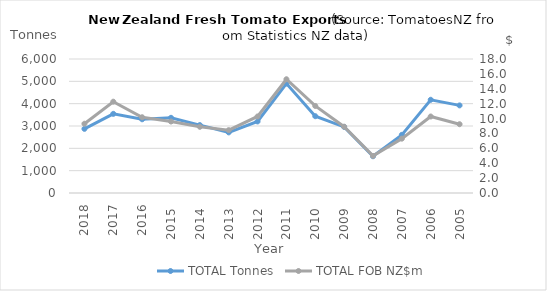
| Category | TOTAL Tonnes |
|---|---|
| 2018.0 | 2872.624 |
| 2017.0 | 3544.228 |
| 2016.0 | 3301.061 |
| 2015.0 | 3366.787 |
| 2014.0 | 3040.504 |
| 2013.0 | 2713.667 |
| 2012.0 | 3203.964 |
| 2011.0 | 4899.924 |
| 2010.0 | 3438.709 |
| 2009.0 | 2957.466 |
| 2008.0 | 1645.515 |
| 2007.0 | 2604.222 |
| 2006.0 | 4174.085 |
| 2005.0 | 3922.489 |